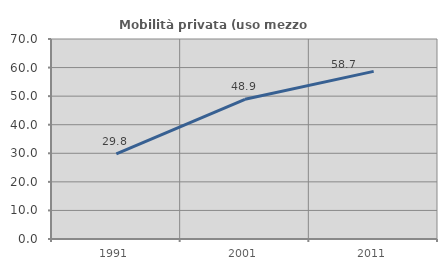
| Category | Mobilità privata (uso mezzo privato) |
|---|---|
| 1991.0 | 29.788 |
| 2001.0 | 48.896 |
| 2011.0 | 58.678 |